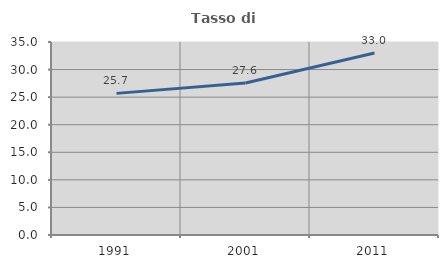
| Category | Tasso di occupazione   |
|---|---|
| 1991.0 | 25.683 |
| 2001.0 | 27.553 |
| 2011.0 | 32.998 |